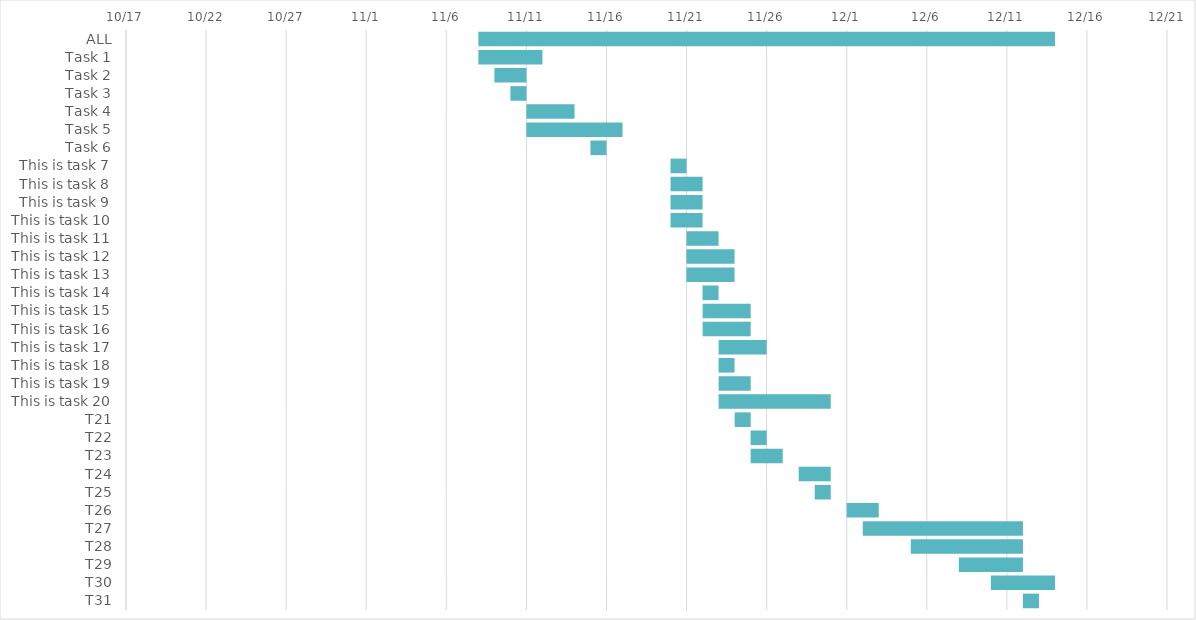
| Category | START DATE | Duration |
|---|---|---|
| ALL | 11/8/18 | 36 |
| Task 1 | 11/8/18 | 4 |
| Task 2 | 11/9/18 | 2 |
| Task 3 | 11/10/18 | 1 |
| Task 4 | 11/11/18 | 3 |
| Task 5 | 11/11/18 | 6 |
| Task 6 | 11/15/18 | 1 |
| This is task 7 | 11/20/18 | 1 |
| This is task 8 | 11/20/18 | 2 |
| This is task 9 | 11/20/18 | 2 |
| This is task 10 | 11/20/18 | 2 |
| This is task 11 | 11/21/18 | 2 |
| This is task 12 | 11/21/18 | 3 |
| This is task 13 | 11/21/18 | 3 |
| This is task 14 | 11/22/18 | 1 |
| This is task 15 | 11/22/18 | 3 |
| This is task 16 | 11/22/18 | 3 |
| This is task 17 | 11/23/18 | 3 |
| This is task 18 | 11/23/18 | 1 |
| This is task 19 | 11/23/18 | 2 |
| This is task 20 | 11/23/18 | 7 |
| T21 | 11/24/18 | 1 |
| T22 | 11/25/18 | 1 |
| T23 | 11/25/18 | 2 |
| T24 | 11/28/18 | 2 |
| T25 | 11/29/18 | 1 |
| T26 | 12/1/18 | 2 |
| T27 | 12/2/18 | 10 |
| T28 | 12/5/18 | 7 |
| T29 | 12/8/18 | 4 |
| T30 | 12/10/18 | 4 |
| T31 | 12/12/18 | 1 |